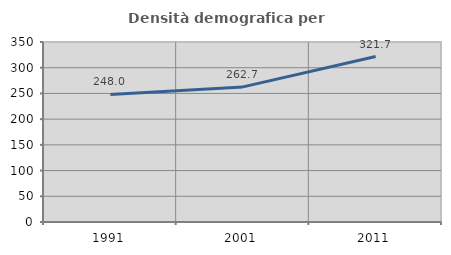
| Category | Densità demografica |
|---|---|
| 1991.0 | 248.039 |
| 2001.0 | 262.697 |
| 2011.0 | 321.709 |